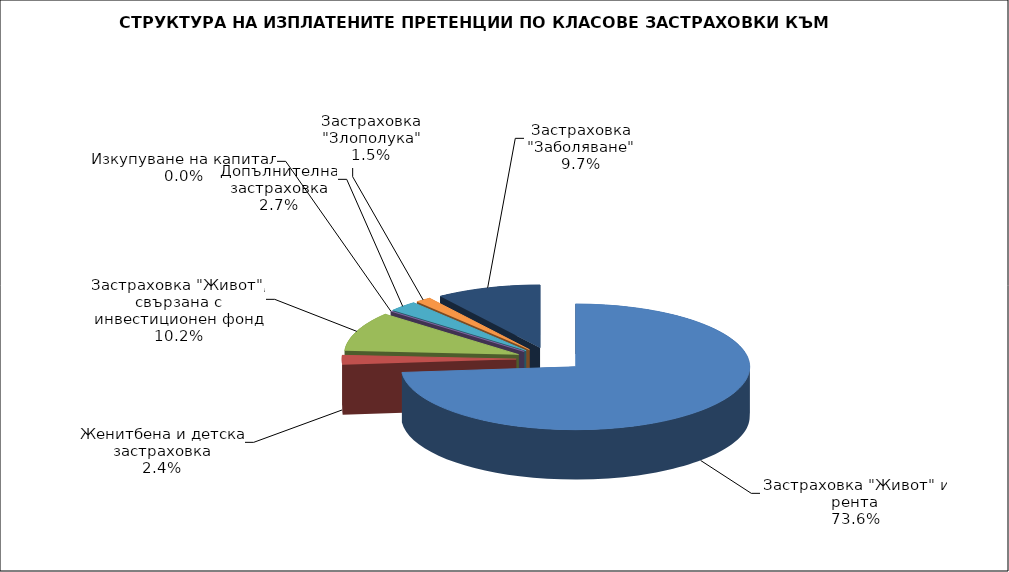
| Category | 114 787 887 |
|---|---|
| Застраховка "Живот" и рента | 114787886.993 |
| Женитбена и детска застраховка | 3725672.301 |
| Застраховка "Живот", свързана с инвестиционен фонд | 15846896.688 |
| Изкупуване на капитал | 0 |
| Допълнителна застраховка | 4224154 |
| Застраховка "Злополука" | 2268985 |
| Застраховка "Заболяване" | 15171915.268 |